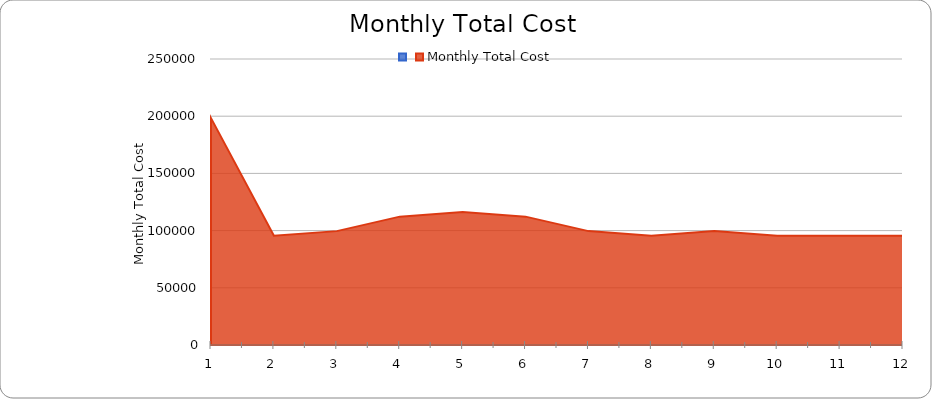
| Category | Series 0 | Monthly Total Cost |
|---|---|---|
| 0 | 1 | 198331.879 |
| 1 | 2 | 95536.879 |
| 2 | 3 | 99536.879 |
| 3 | 4 | 112203.546 |
| 4 | 5 | 116203.546 |
| 5 | 6 | 112203.546 |
| 6 | 7 | 99536.879 |
| 7 | 8 | 95536.879 |
| 8 | 9 | 99536.879 |
| 9 | 10 | 95536.879 |
| 10 | 11 | 95536.879 |
| 11 | 12 | 95536.879 |